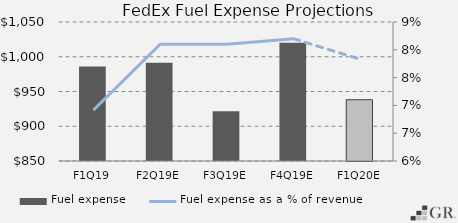
| Category | Fuel expense |
|---|---|
|  F1Q19  | 986 |
|  F2Q19E  | 991.29 |
|  F3Q19E  | 921.474 |
|  F4Q19E  | 1019.969 |
|  F1Q20E  | 938.172 |